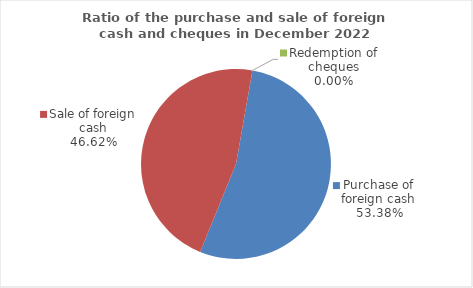
| Category | Series 0 |
|---|---|
| Purchase of foreign cash | 53.383 |
| Sale of foreign cash | 46.617 |
| Redemption of cheques | 0 |